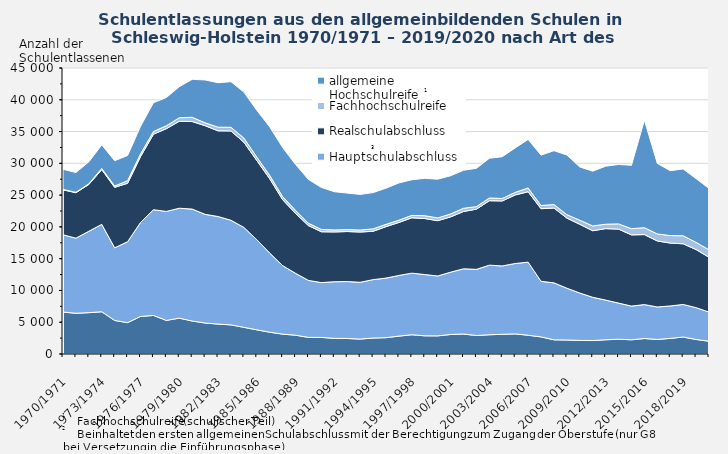
| Category | Ohne Abschluss | Hauptschulabschluss | Realschulabschluss | Fachhochschulreife | allgemeine Hochschulreife |
|---|---|---|---|---|---|
| 1970/1971 | 6600 | 12162 | 7074 | 63 | 3168 |
| 1971/1972 | 6410 | 11816 | 7157 | 58 | 3102 |
| 1972/1973 | 6504 | 12809 | 7365 | 100 | 3463 |
| 1973/1974 | 6645 | 13753 | 8626 | 168 | 3712 |
| 1974/1975 | 5277 | 11431 | 9516 | 214 | 3978 |
| 1975/1976 | 4932 | 12732 | 9201 | 414 | 3948 |
| 1976/1977 | 5904 | 14788 | 10366 | 417 | 4335 |
| 1977/1978 | 6069 | 16633 | 11883 | 422 | 4529 |
| 1978/1979 | 5288 | 17144 | 13021 | 459 | 4439 |
| 1979/1980 | 5640 | 17296 | 13681 | 549 | 4897 |
| 1980/1981 | 5190 | 17613 | 13773 | 672 | 5967 |
| 1981/1982 | 4875 | 17100 | 13946 | 454 | 6747 |
| 1982/1983 | 4710 | 16922 | 13483 | 575 | 6990 |
| 1983/1984 | 4581 | 16463 | 14051 | 574 | 7176 |
| 1984/1985 | 4199 | 15718 | 13407 | 648 | 7233 |
| 1985/1986 | 3804 | 14184 | 12462 | 546 | 7350 |
| 1986/1987 | 3429 | 12453 | 11696 | 520 | 7631 |
| 1987/1988 | 3127 | 10779 | 10378 | 479 | 7735 |
| 1988/1989 | 2960 | 9738 | 9428 | 475 | 7219 |
| 1989/1990 | 2616 | 8964 | 8617 | 372 | 6887 |
| 1990/1991 | 2610 | 8625 | 8001 | 363 | 6612 |
| 1991/1992 | 2461 | 8911 | 7836 | 313 | 6017 |
| 1992/1993 | 2441 | 8955 | 7875 | 297 | 5747 |
| 1993/1994 | 2350 | 8934 | 7911 | 315 | 5601 |
| 1994/1995 | 2511 | 9191 | 7606 | 379 | 5706 |
| 1995/1996 | 2571 | 9372 | 8094 | 363 | 5691 |
| 1996/1997 | 2813 | 9546 | 8337 | 363 | 5858 |
| 1997/1998 | 3030 | 9692 | 8713 | 379 | 5602 |
| 1998/1999 | 2863 | 9639 | 8811 | 450 | 5872 |
| 1999/2000 | 2854 | 9419 | 8706 | 431 | 6095 |
| 2000/2001 | 3072 | 9801 | 8700 | 462 | 6009 |
| 2001/2002 | 3144 | 10263 | 9018 | 510 | 5976 |
| 2002/2003 | 2907 | 10410 | 9474 | 396 | 6024 |
| 2003/2004 | 3030 | 10944 | 10146 | 426 | 6249 |
| 2004/2005 | 3099 | 10758 | 10227 | 393 | 6570 |
| 2005/2006 | 3165 | 11073 | 10785 | 405 | 6993 |
| 2006/2007 | 2952 | 11502 | 11079 | 594 | 7632 |
| 2007/2008 | 2691 | 8748 | 11424 | 501 | 7926 |
| 2008/2009 | 2232 | 8961 | 11778 | 540 | 8481 |
| 2009/2010 | 2202 | 8151 | 11031 | 537 | 9387 |
| 2010/2011 | 2142 | 7452 | 10815 | 651 | 8367 |
| 2011/2012 | 2115 | 6807 | 10473 | 756 | 8616 |
| 2012/2013 | 2238 | 6246 | 11241 | 693 | 9126 |
| 2013/2014 | 2322 | 5688 | 11640 | 822 | 9351 |
| 2014/2015 | 2235 | 5301 | 11208 | 975 | 9972 |
| 2015/2016 | 2436 | 5337 | 11016 | 1089 | 16914 |
| 2016/2017 | 2292 | 5106 | 10386 | 1110 | 11091 |
| 2017/2018 | 2454 | 5106 | 9897 | 1176 | 10209 |
| 2018/2019 | 2673 | 5121 | 9546 | 1266 | 10512 |
| 2019/2020 | 2283 | 5010 | 9141 | 1131 | 10023 |
| 2020/2021 | 2013 | 4581 | 8625 | 1176 | 9660 |